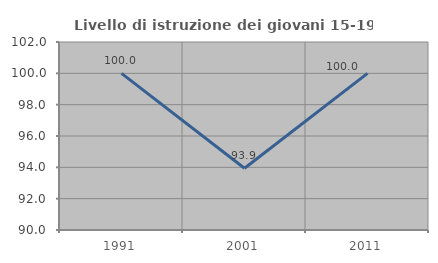
| Category | Livello di istruzione dei giovani 15-19 anni |
|---|---|
| 1991.0 | 100 |
| 2001.0 | 93.939 |
| 2011.0 | 100 |